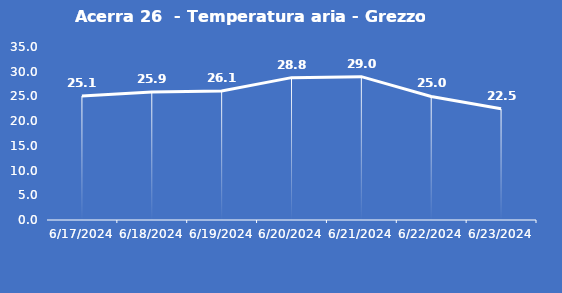
| Category | Acerra 26  - Temperatura aria - Grezzo (°C) |
|---|---|
| 6/17/24 | 25.1 |
| 6/18/24 | 25.9 |
| 6/19/24 | 26.1 |
| 6/20/24 | 28.8 |
| 6/21/24 | 29 |
| 6/22/24 | 25 |
| 6/23/24 | 22.5 |